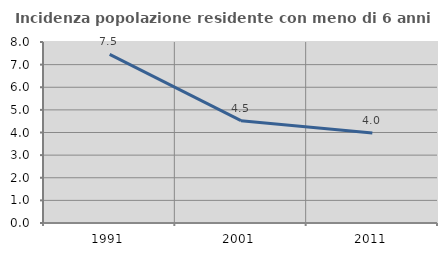
| Category | Incidenza popolazione residente con meno di 6 anni |
|---|---|
| 1991.0 | 7.453 |
| 2001.0 | 4.523 |
| 2011.0 | 3.978 |